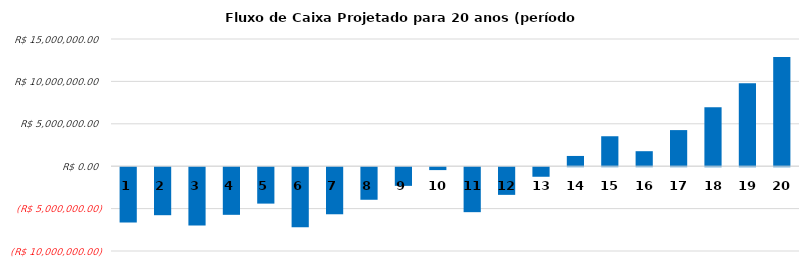
| Category | Series 0 |
|---|---|
| 0 | -6517532.342 |
| 1 | -5660648.962 |
| 2 | -6887852.004 |
| 3 | -5615523.24 |
| 4 | -4293200.854 |
| 5 | -7092615.518 |
| 6 | -5550404.029 |
| 7 | -3840324.488 |
| 8 | -2201161.249 |
| 9 | -340827.488 |
| 10 | -5302594.441 |
| 11 | -3262178.205 |
| 12 | -1127778.619 |
| 13 | 1208388.927 |
| 14 | 3532089.076 |
| 15 | 1768994.972 |
| 16 | 4257509.279 |
| 17 | 6952750.198 |
| 18 | 9788151.928 |
| 19 | 12869490.837 |